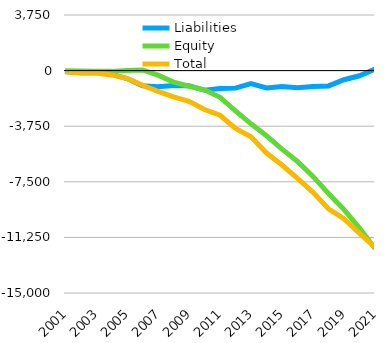
| Category | Liabilities  | Equity  | Total  |
|---|---|---|---|
| 2001 | -59.708 | -14.154 | -73.862 |
| 2002 | -149.881 | -20.245 | -170.126 |
| 2003 | -126.003 | -35.629 | -161.632 |
| 2004 | -238.742 | -52.018 | -290.76 |
| 2005 | -533.356 | 8.127 | -525.229 |
| 2006 | -1028.114 | 41.007 | -987.107 |
| 2007 | -1093.755 | -303.794 | -1397.549 |
| 2008 | -1001.434 | -776.931 | -1778.365 |
| 2009 | -1014.903 | -1052.704 | -2067.607 |
| 2010 | -1329.448 | -1291.918 | -2621.366 |
| 2011 | -1213.682 | -1799.658 | -3013.34 |
| 2012 | -1182.258 | -2715.7 | -3897.958 |
| 2013 | -872.638 | -3589.889 | -4462.527 |
| 2014 | -1165.872 | -4394.533 | -5560.405 |
| 2015 | -1067.299 | -5300.709 | -6368.008 |
| 2016 | -1149.776 | -6125.043 | -7274.819 |
| 2017 | -1076.033 | -7137.883 | -8213.916 |
| 2018 | -1032.184 | -8289.783 | -9321.967 |
| 2019 | -615.046 | -9372.659 | -9987.705 |
| 2020 | -350.593 | -10626.956 | -10977.549 |
| 2021 | 97.984 | -11997.188 | -11899.204 |